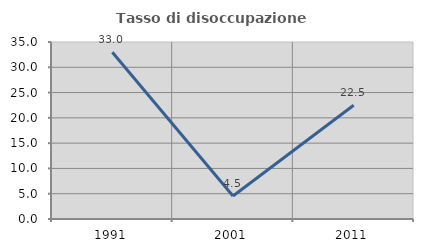
| Category | Tasso di disoccupazione giovanile  |
|---|---|
| 1991.0 | 32.979 |
| 2001.0 | 4.545 |
| 2011.0 | 22.5 |